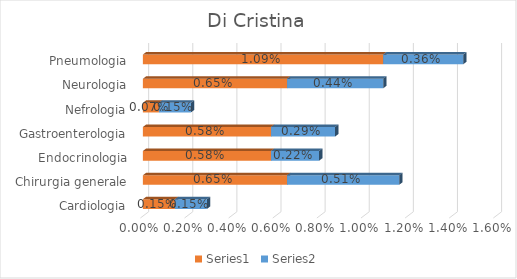
| Category | Series 0 | Series 1 |
|---|---|---|
| Cardiologia | 0.001 | 0.001 |
| Chirurgia generale | 0.007 | 0.005 |
| Endocrinologia | 0.006 | 0.002 |
| Gastroenterologia | 0.006 | 0.003 |
| Nefrologia | 0.001 | 0.001 |
| Neurologia | 0.007 | 0.004 |
| Pneumologia | 0.011 | 0.004 |